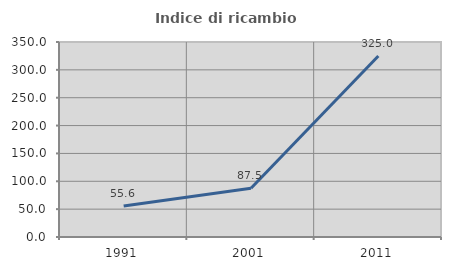
| Category | Indice di ricambio occupazionale  |
|---|---|
| 1991.0 | 55.556 |
| 2001.0 | 87.5 |
| 2011.0 | 325 |